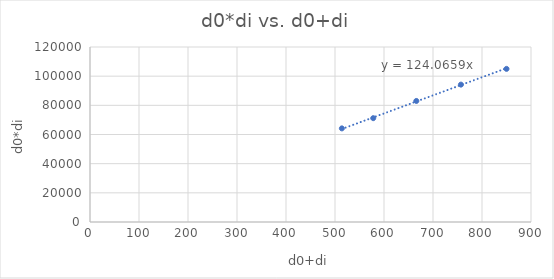
| Category | Series 0 |
|---|---|
| 514.0 | 64200 |
| 578.0 | 71200 |
| 666.0 | 83000 |
| 757.0 | 94200 |
| 850.0 | 105000 |